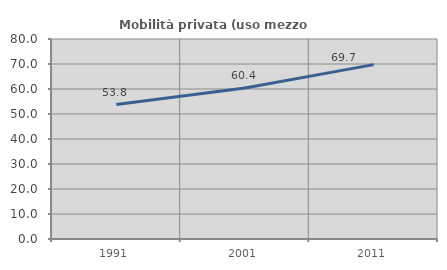
| Category | Mobilità privata (uso mezzo privato) |
|---|---|
| 1991.0 | 53.766 |
| 2001.0 | 60.364 |
| 2011.0 | 69.741 |